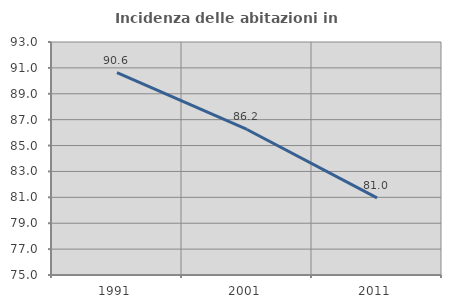
| Category | Incidenza delle abitazioni in proprietà  |
|---|---|
| 1991.0 | 90.634 |
| 2001.0 | 86.243 |
| 2011.0 | 80.952 |